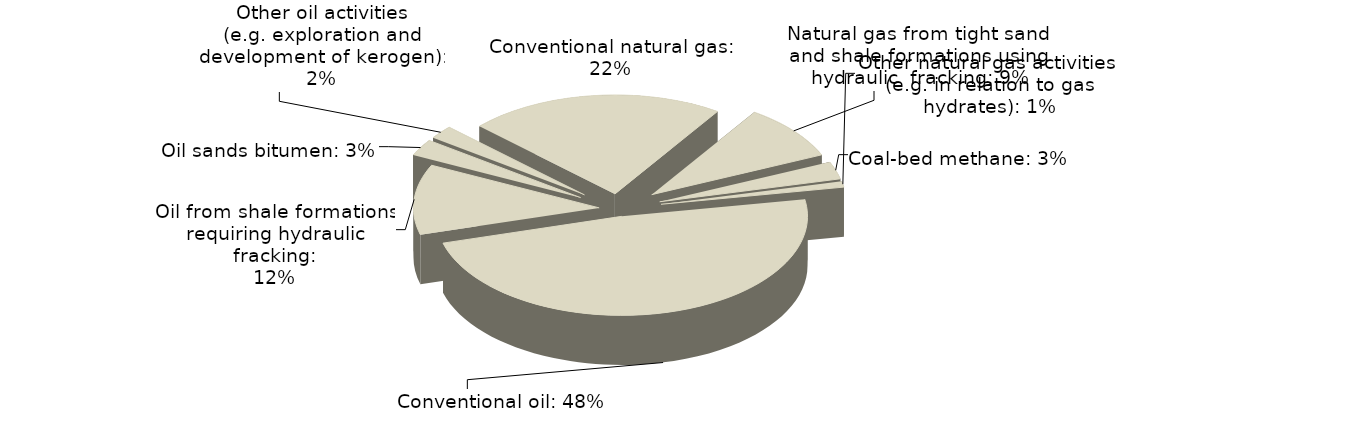
| Category | Series 0 |
|---|---|
| Conventional oil | 48.415 |
| Oil from shale formations requiring hydraulic fracking | 11.451 |
| Oil sands bitumen | 2.724 |
| Other oil activities (e.g. exploration and development of kerogen) | 2.181 |
| Conventional natural gas | 22.318 |
| Natural gas from tight sand and shale formations using hydraulic fracking | 9.096 |
| Coal-bed methane | 2.869 |
| Other natural gas activities (e.g. in relation to gas hydrates) | 0.946 |